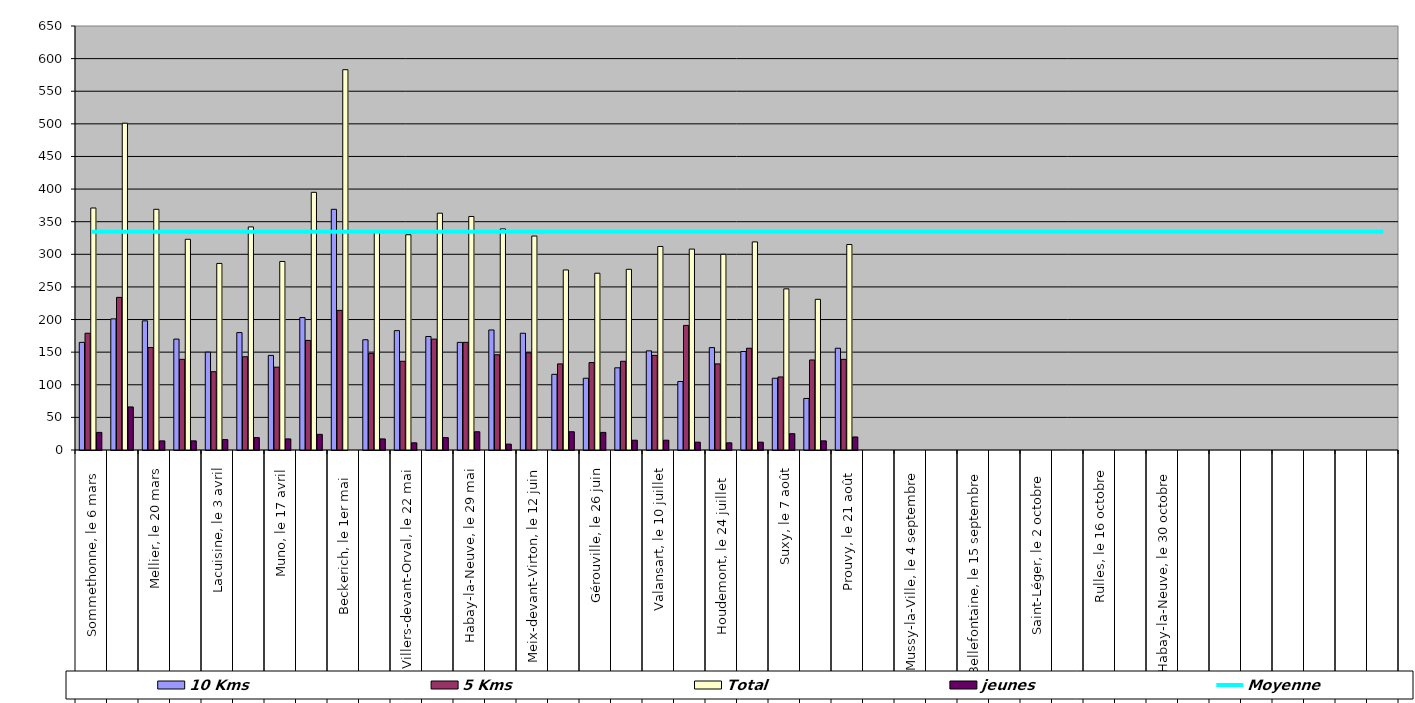
| Category | 10 Kms | 5 Kms | Total | jeunes |
|---|---|---|---|---|
| 0 | 165 | 179 | 371 | 27 |
| 1 | 201 | 234 | 501 | 66 |
| 2 | 198 | 157 | 369 | 14 |
| 3 | 170 | 139 | 323 | 14 |
| 4 | 150 | 120 | 286 | 16 |
| 5 | 180 | 143 | 342 | 19 |
| 6 | 145 | 127 | 289 | 17 |
| 7 | 203 | 168 | 395 | 24 |
| 8 | 369 | 214 | 583 | 0 |
| 9 | 169 | 148 | 334 | 17 |
| 10 | 183 | 136 | 330 | 11 |
| 11 | 174 | 170 | 363 | 19 |
| 12 | 165 | 165 | 358 | 28 |
| 13 | 184 | 146 | 339 | 9 |
| 14 | 179 | 149 | 328 | 0 |
| 15 | 116 | 132 | 276 | 28 |
| 16 | 110 | 134 | 271 | 27 |
| 17 | 126 | 136 | 277 | 15 |
| 18 | 152 | 145 | 312 | 15 |
| 19 | 105 | 191 | 308 | 12 |
| 20 | 157 | 132 | 300 | 11 |
| 21 | 151 | 156 | 319 | 12 |
| 22 | 110 | 112 | 247 | 25 |
| 23 | 79 | 138 | 231 | 14 |
| 24 | 156 | 139 | 315 | 20 |
| 25 | 0 | 0 | 0 | 0 |
| 26 | 0 | 0 | 0 | 0 |
| 27 | 0 | 0 | 0 | 0 |
| 28 | 0 | 0 | 0 | 0 |
| 29 | 0 | 0 | 0 | 0 |
| 30 | 0 | 0 | 0 | 0 |
| 31 | 0 | 0 | 0 | 0 |
| 32 | 0 | 0 | 0 | 0 |
| 33 | 0 | 0 | 0 | 0 |
| 34 | 0 | 0 | 0 | 0 |
| 35 | 0 | 0 | 0 | 0 |
| 36 | 0 | 0 | 0 | 0 |
| 37 | 0 | 0 | 0 | 0 |
| 38 | 0 | 0 | 0 | 0 |
| 39 | 0 | 0 | 0 | 0 |
| 40 | 0 | 0 | 0 | 0 |
| 41 | 0 | 0 | 0 | 0 |